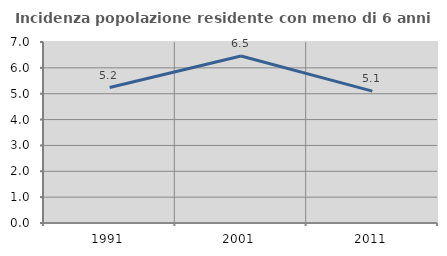
| Category | Incidenza popolazione residente con meno di 6 anni |
|---|---|
| 1991.0 | 5.238 |
| 2001.0 | 6.459 |
| 2011.0 | 5.101 |